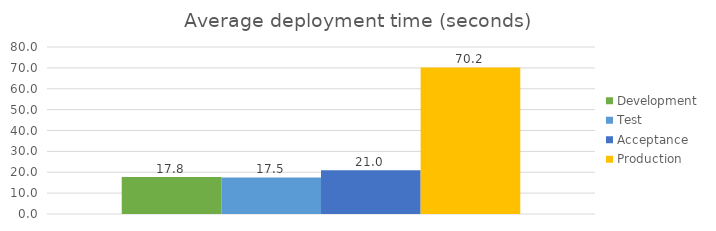
| Category | Development | Test | Acceptance | Production |
|---|---|---|---|---|
| Total | 17.757 | 17.541 | 21 | 70.222 |